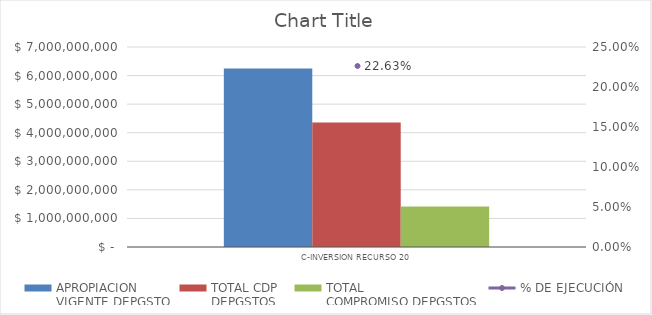
| Category | APROPIACION
VIGENTE DEPGSTO | TOTAL CDP
DEPGSTOS | TOTAL
COMPROMISO DEPGSTOS |
|---|---|---|---|
| C-INVERSION RECURSO 20 | 6251000000 | 4354362275 | 1414534618 |